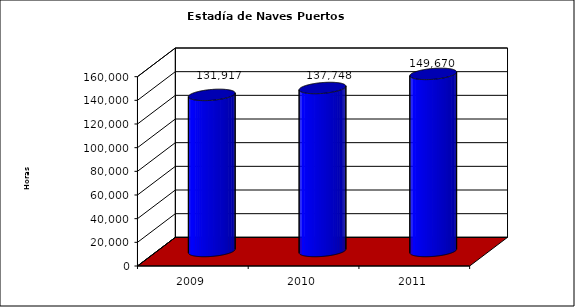
| Category | Series 0 |
|---|---|
| 2009.0 | 131916.807 |
| 2010.0 | 137748.436 |
| 2011.0 | 149670.13 |